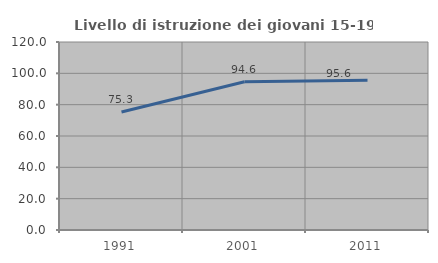
| Category | Livello di istruzione dei giovani 15-19 anni |
|---|---|
| 1991.0 | 75.293 |
| 2001.0 | 94.63 |
| 2011.0 | 95.593 |